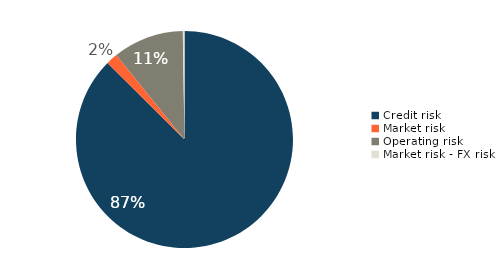
| Category | Series 0 |
|---|---|
| Credit risk | 0.874 |
| Market risk | 0.017 |
| Operating risk | 0.106 |
| Market risk - FX risk | 0.002 |